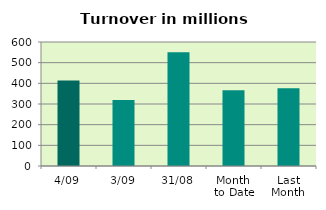
| Category | Series 0 |
|---|---|
| 4/09 | 414.063 |
| 3/09 | 319.871 |
| 31/08 | 550.62 |
| Month 
to Date | 366.967 |
| Last
Month | 376.258 |